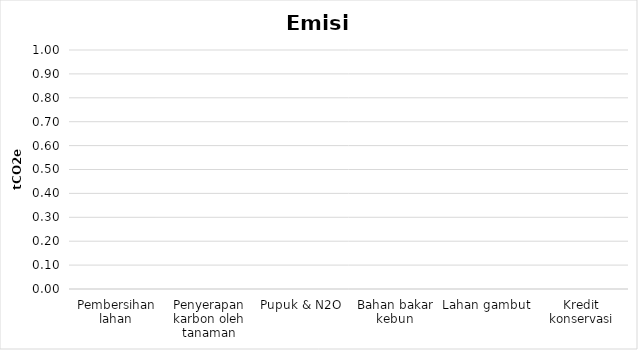
| Category | Series 0 |
|---|---|
| Pembersihan lahan | 0 |
| Penyerapan karbon oleh tanaman | 0 |
| Pupuk & N2O | 0 |
| Bahan bakar kebun | 0 |
| Lahan gambut | 0 |
| Kredit konservasi | 0 |